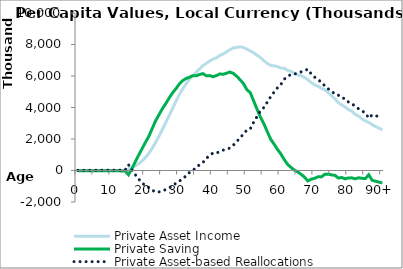
| Category | Private Asset Income | Private Saving | Private Asset-based Reallocations |
|---|---|---|---|
| 0 | -15.102 | -11516.96 | 11501.858 |
|  | -10.155 | -12213.826 | 12203.671 |
| 2 | -5.209 | -12910.693 | 12905.484 |
| 3 | -0.262 | -13607.559 | 13607.297 |
| 4 | 4.685 | -14304.426 | 14309.111 |
| 5 | 9.632 | -15143.109 | 15152.741 |
| 6 | 0 | -16498.316 | 16498.316 |
| 7 | 0 | -18023.291 | 18023.291 |
| 8 | 0 | -18873.492 | 18873.492 |
| 9 | 0 | -19643.948 | 19643.948 |
| 10 | 0 | -20909.518 | 20909.518 |
| 11 | 0 | -21804.294 | 21804.294 |
| 12 | 0 | -23098.41 | 23098.41 |
| 13 | 0 | -24582.716 | 24582.716 |
| 14 | 0 | -25983.053 | 25983.053 |
| 15 | 98913.388 | -269426.759 | 368340.148 |
| 16 | 177152.913 | 119876.988 | 57275.924 |
| 17 | 286623.592 | 549380.98 | -262757.388 |
| 18 | 427870.391 | 967135.602 | -539265.212 |
| 19 | 597188.379 | 1377403.654 | -780215.276 |
| 20 | 813328.044 | 1780435.913 | -967107.869 |
| 21 | 1081968.226 | 2163003.221 | -1081034.995 |
| 22 | 1406054.4 | 2654552.807 | -1248498.407 |
| 23 | 1773539.499 | 3143208.746 | -1369669.247 |
| 24 | 2173520.727 | 3534833.247 | -1361312.52 |
| 25 | 2606069.574 | 3917688.566 | -1311618.992 |
| 26 | 3030303.591 | 4239757.237 | -1209453.646 |
| 27 | 3483836.177 | 4599027.329 | -1115191.152 |
| 28 | 3922548.733 | 4921144.838 | -998596.106 |
| 29 | 4377798.577 | 5185382.168 | -807583.591 |
| 30 | 4807693.293 | 5487843.953 | -680150.66 |
| 31 | 5172244.213 | 5702436.869 | -530192.657 |
| 32 | 5499634.237 | 5840299.826 | -340665.589 |
| 33 | 5785743.912 | 5918861.603 | -133117.691 |
| 34 | 6010986.212 | 6023831.803 | -12845.591 |
| 35 | 6223974.792 | 6011386.893 | 212587.898 |
| 36 | 6451927.059 | 6093075.328 | 358851.731 |
| 37 | 6652083.084 | 6151358.157 | 500724.926 |
| 38 | 6803559.599 | 6013820.361 | 789739.238 |
| 39 | 6948130.544 | 6026438.08 | 921692.464 |
| 40 | 7078452.123 | 5952900.688 | 1125551.435 |
| 41 | 7156514.921 | 6028673.414 | 1127841.507 |
| 42 | 7312569.102 | 6132918.59 | 1179650.511 |
| 43 | 7400949.071 | 6105664.155 | 1295284.916 |
| 44 | 7535834.198 | 6181602.734 | 1354231.464 |
| 45 | 7674892.971 | 6249324.727 | 1425568.244 |
| 46 | 7775465.801 | 6163769.896 | 1611695.905 |
| 47 | 7815704.066 | 5980556.259 | 1835147.806 |
| 48 | 7851700.24 | 5757813.591 | 2093886.649 |
| 49 | 7813828.84 | 5508259.545 | 2305569.295 |
| 50 | 7700142.151 | 5126290.944 | 2573851.206 |
| 51 | 7587579.908 | 4939995.059 | 2647584.849 |
| 52 | 7473824.853 | 4409042.937 | 3064781.916 |
| 53 | 7309806.276 | 3885686.366 | 3424119.91 |
| 54 | 7178392.155 | 3390548.008 | 3787844.147 |
| 55 | 6970284.662 | 2970523.546 | 3999761.116 |
| 56 | 6806955.512 | 2474014.833 | 4332940.679 |
| 57 | 6674376.032 | 1996376.076 | 4677999.956 |
| 58 | 6646037.74 | 1677136.32 | 4968901.42 |
| 59 | 6596532.108 | 1352903.215 | 5243628.892 |
| 60 | 6503100.199 | 1055699.539 | 5447400.66 |
| 61 | 6495727.653 | 702387.943 | 5793339.71 |
| 62 | 6361490.581 | 389693.695 | 5971796.886 |
| 63 | 6298608.318 | 199222.964 | 6099385.354 |
| 64 | 6169450.578 | 33154.976 | 6136295.603 |
| 65 | 6066216.816 | -89902.197 | 6156119.013 |
| 66 | 6018070.699 | -243065.202 | 6261135.901 |
| 67 | 5910454.719 | -417448.159 | 6327902.879 |
| 68 | 5768787.22 | -663596.395 | 6432383.614 |
| 69 | 5578806.06 | -551144.86 | 6129950.92 |
| 70 | 5436407.385 | -494574.576 | 5930981.962 |
| 71 | 5355461.855 | -397992.487 | 5753454.342 |
| 72 | 5214044.617 | -406503.389 | 5620548.005 |
| 73 | 5128115.501 | -241103.42 | 5369218.921 |
| 74 | 4957454.046 | -229323.758 | 5186777.804 |
| 75 | 4751738.188 | -276562.207 | 5028300.394 |
| 76 | 4549831.484 | -306870.377 | 4856701.861 |
| 77 | 4307945.017 | -478946.412 | 4786891.429 |
| 78 | 4165191.223 | -442488.616 | 4607679.839 |
| 79 | 4031698.301 | -532739.016 | 4564437.316 |
| 80 | 3870611.137 | -472650.869 | 4343262.007 |
| 81 | 3765529.938 | -467231.714 | 4232761.652 |
| 82 | 3558502.317 | -527539.181 | 4086041.498 |
| 83 | 3455005.724 | -460008.629 | 3915014.353 |
| 84 | 3282340.146 | -497726.693 | 3780066.84 |
| 85 | 3139330.487 | -512993.195 | 3652323.682 |
| 86 | 3054094.428 | -268575.849 | 3322670.277 |
| 87 | 2905195.523 | -623591.338 | 3528786.862 |
| 88 | 2795031.737 | -680537.266 | 3475569.003 |
| 89 | 2685627.517 | -736723.627 | 3422351.144 |
| 90+ | 2580576.271 | -788557.014 | 3369133.285 |